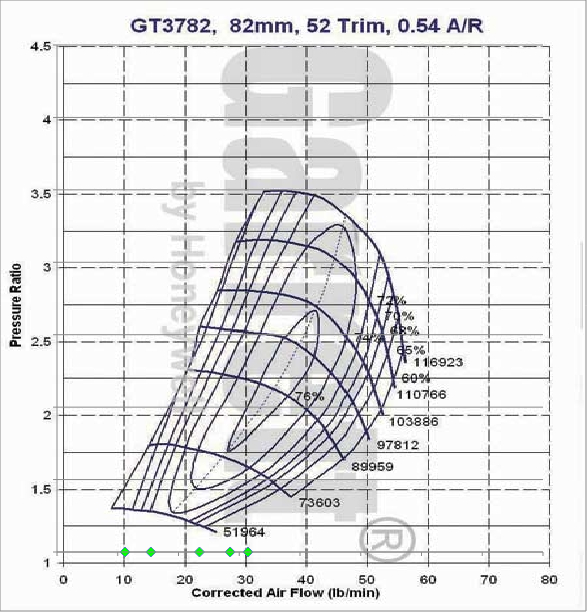
| Category | Series 0 |
|---|---|
| 11.193001528719252 | 1 |
| 15.447198609721553 | 1 |
| 23.455737621986625 | 1 |
| 28.494377555598568 | 1 |
| 31.43937572369245 | 1 |